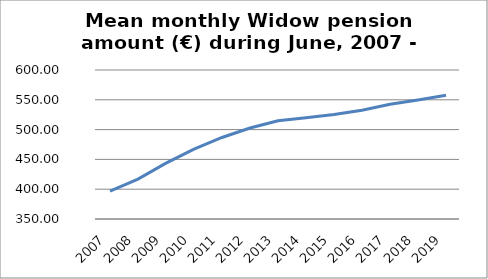
| Category | Series 0 |
|---|---|
| 2007.0 | 396.928 |
| 2008.0 | 416.865 |
| 2009.0 | 443.721 |
| 2010.0 | 467.367 |
| 2011.0 | 486.787 |
| 2012.0 | 502.695 |
| 2013.0 | 514.839 |
| 2014.0 | 519.7 |
| 2015.0 | 525.45 |
| 2016.0 | 532.34 |
| 2017.0 | 542.54 |
| 2018.0 | 549.67 |
| 2019.0 | 557.77 |